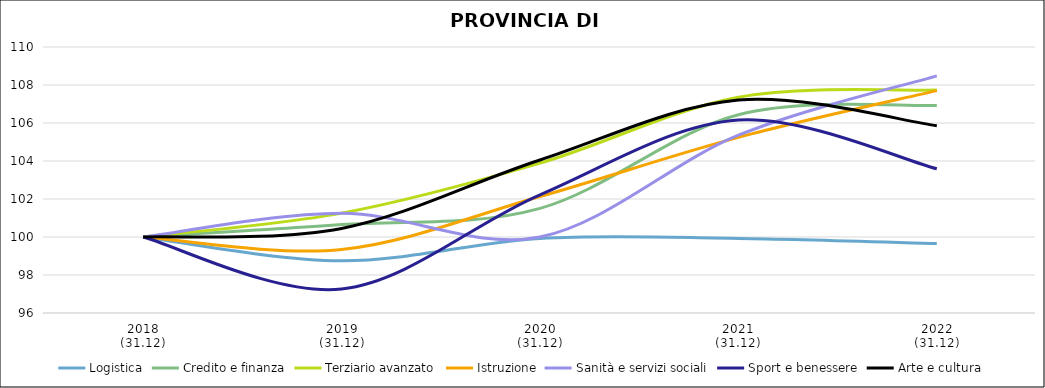
| Category | Logistica | Credito e finanza | Terziario avanzato | Istruzione | Sanità e servizi sociali | Sport e benessere | Arte e cultura |
|---|---|---|---|---|---|---|---|
| 2018
(31.12) | 100 | 100 | 100 | 100 | 100 | 100 | 100 |
| 2019
(31.12) | 98.745 | 100.652 | 101.256 | 99.344 | 101.25 | 97.265 | 100.45 |
| 2020
(31.12) | 99.924 | 101.507 | 103.888 | 102.131 | 100 | 102.222 | 104.054 |
| 2021
(31.12) | 99.924 | 106.436 | 107.358 | 105.246 | 105.357 | 106.154 | 107.207 |
| 2022
(31.12) | 99.658 | 106.925 | 107.737 | 107.705 | 108.482 | 103.59 | 105.856 |